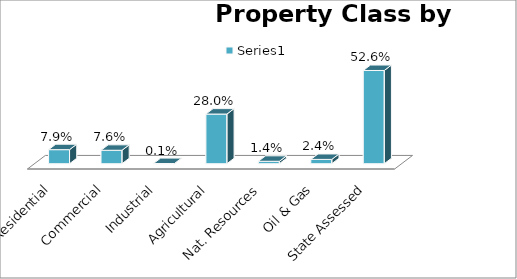
| Category | Series 0 |
|---|---|
| Residential | 0.079 |
| Commercial | 0.076 |
| Industrial | 0.001 |
| Agricultural | 0.28 |
| Nat. Resources | 0.014 |
| Oil & Gas | 0.024 |
| State Assessed | 0.526 |